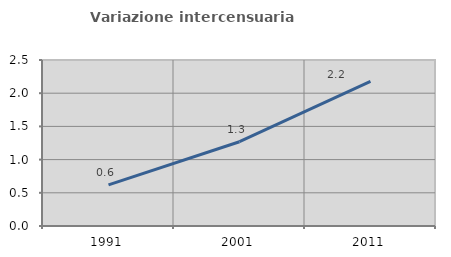
| Category | Variazione intercensuaria annua |
|---|---|
| 1991.0 | 0.619 |
| 2001.0 | 1.269 |
| 2011.0 | 2.177 |